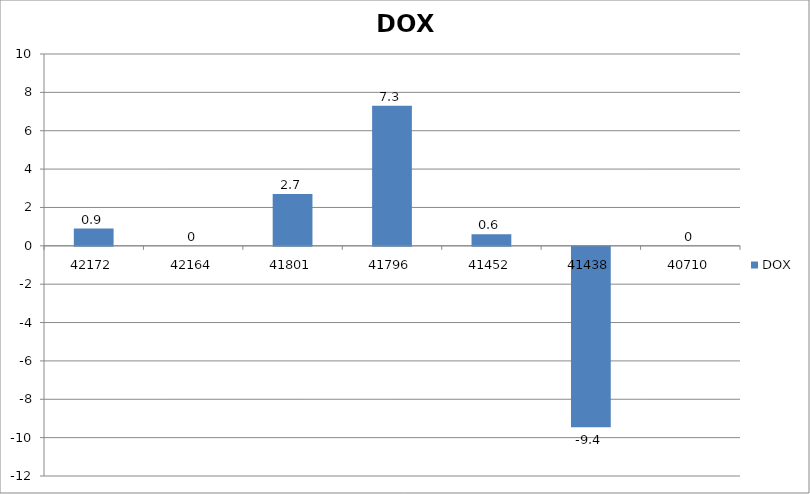
| Category | DOX |
|---|---|
| 42172.0 | 0.9 |
| 42164.0 | 0 |
| 41801.0 | 2.7 |
| 41796.0 | 7.3 |
| 41452.0 | 0.6 |
| 41438.0 | -9.4 |
| 40710.0 | 0 |